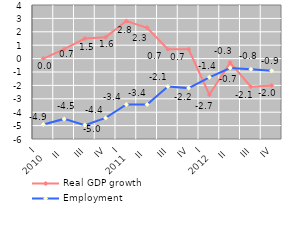
| Category | Real GDP growth | Employment |
|---|---|---|
| I
2010 | 0 | -4.917 |
| II | 0.7 | -4.501 |
| III | 1.5 | -4.963 |
| IV | 1.6 | -4.43 |
| I
2011 | 2.8 | -3.427 |
| II | 2.3 | -3.424 |
| III | 0.7 | -2.085 |
| IV | 0.7 | -2.202 |
| I
2012 | -2.7 | -1.4 |
| II | -0.3 | -0.7 |
| III | -2.1 | -0.8 |
| IV | -2 | -0.9 |